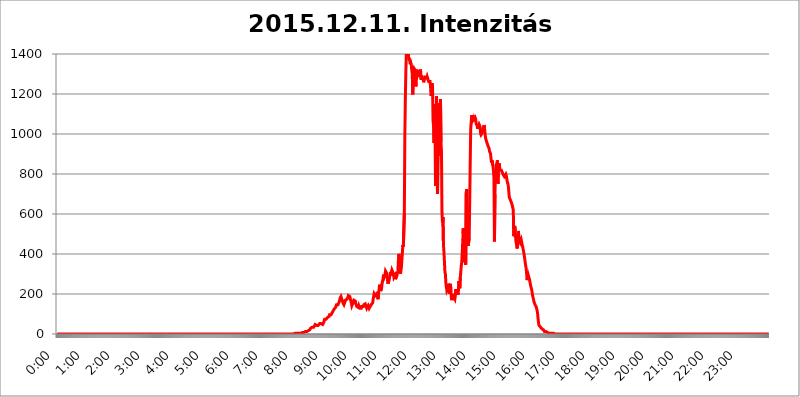
| Category | 2015.12.11. Intenzitás [W/m^2] |
|---|---|
| 0.0 | 0 |
| 0.0006944444444444445 | 0 |
| 0.001388888888888889 | 0 |
| 0.0020833333333333333 | 0 |
| 0.002777777777777778 | 0 |
| 0.003472222222222222 | 0 |
| 0.004166666666666667 | 0 |
| 0.004861111111111111 | 0 |
| 0.005555555555555556 | 0 |
| 0.0062499999999999995 | 0 |
| 0.006944444444444444 | 0 |
| 0.007638888888888889 | 0 |
| 0.008333333333333333 | 0 |
| 0.009027777777777779 | 0 |
| 0.009722222222222222 | 0 |
| 0.010416666666666666 | 0 |
| 0.011111111111111112 | 0 |
| 0.011805555555555555 | 0 |
| 0.012499999999999999 | 0 |
| 0.013194444444444444 | 0 |
| 0.013888888888888888 | 0 |
| 0.014583333333333332 | 0 |
| 0.015277777777777777 | 0 |
| 0.015972222222222224 | 0 |
| 0.016666666666666666 | 0 |
| 0.017361111111111112 | 0 |
| 0.018055555555555557 | 0 |
| 0.01875 | 0 |
| 0.019444444444444445 | 0 |
| 0.02013888888888889 | 0 |
| 0.020833333333333332 | 0 |
| 0.02152777777777778 | 0 |
| 0.022222222222222223 | 0 |
| 0.02291666666666667 | 0 |
| 0.02361111111111111 | 0 |
| 0.024305555555555556 | 0 |
| 0.024999999999999998 | 0 |
| 0.025694444444444447 | 0 |
| 0.02638888888888889 | 0 |
| 0.027083333333333334 | 0 |
| 0.027777777777777776 | 0 |
| 0.02847222222222222 | 0 |
| 0.029166666666666664 | 0 |
| 0.029861111111111113 | 0 |
| 0.030555555555555555 | 0 |
| 0.03125 | 0 |
| 0.03194444444444445 | 0 |
| 0.03263888888888889 | 0 |
| 0.03333333333333333 | 0 |
| 0.034027777777777775 | 0 |
| 0.034722222222222224 | 0 |
| 0.035416666666666666 | 0 |
| 0.036111111111111115 | 0 |
| 0.03680555555555556 | 0 |
| 0.0375 | 0 |
| 0.03819444444444444 | 0 |
| 0.03888888888888889 | 0 |
| 0.03958333333333333 | 0 |
| 0.04027777777777778 | 0 |
| 0.04097222222222222 | 0 |
| 0.041666666666666664 | 0 |
| 0.042361111111111106 | 0 |
| 0.04305555555555556 | 0 |
| 0.043750000000000004 | 0 |
| 0.044444444444444446 | 0 |
| 0.04513888888888889 | 0 |
| 0.04583333333333334 | 0 |
| 0.04652777777777778 | 0 |
| 0.04722222222222222 | 0 |
| 0.04791666666666666 | 0 |
| 0.04861111111111111 | 0 |
| 0.049305555555555554 | 0 |
| 0.049999999999999996 | 0 |
| 0.05069444444444445 | 0 |
| 0.051388888888888894 | 0 |
| 0.052083333333333336 | 0 |
| 0.05277777777777778 | 0 |
| 0.05347222222222222 | 0 |
| 0.05416666666666667 | 0 |
| 0.05486111111111111 | 0 |
| 0.05555555555555555 | 0 |
| 0.05625 | 0 |
| 0.05694444444444444 | 0 |
| 0.057638888888888885 | 0 |
| 0.05833333333333333 | 0 |
| 0.05902777777777778 | 0 |
| 0.059722222222222225 | 0 |
| 0.06041666666666667 | 0 |
| 0.061111111111111116 | 0 |
| 0.06180555555555556 | 0 |
| 0.0625 | 0 |
| 0.06319444444444444 | 0 |
| 0.06388888888888888 | 0 |
| 0.06458333333333334 | 0 |
| 0.06527777777777778 | 0 |
| 0.06597222222222222 | 0 |
| 0.06666666666666667 | 0 |
| 0.06736111111111111 | 0 |
| 0.06805555555555555 | 0 |
| 0.06874999999999999 | 0 |
| 0.06944444444444443 | 0 |
| 0.07013888888888889 | 0 |
| 0.07083333333333333 | 0 |
| 0.07152777777777779 | 0 |
| 0.07222222222222223 | 0 |
| 0.07291666666666667 | 0 |
| 0.07361111111111111 | 0 |
| 0.07430555555555556 | 0 |
| 0.075 | 0 |
| 0.07569444444444444 | 0 |
| 0.0763888888888889 | 0 |
| 0.07708333333333334 | 0 |
| 0.07777777777777778 | 0 |
| 0.07847222222222222 | 0 |
| 0.07916666666666666 | 0 |
| 0.0798611111111111 | 0 |
| 0.08055555555555556 | 0 |
| 0.08125 | 0 |
| 0.08194444444444444 | 0 |
| 0.08263888888888889 | 0 |
| 0.08333333333333333 | 0 |
| 0.08402777777777777 | 0 |
| 0.08472222222222221 | 0 |
| 0.08541666666666665 | 0 |
| 0.08611111111111112 | 0 |
| 0.08680555555555557 | 0 |
| 0.08750000000000001 | 0 |
| 0.08819444444444445 | 0 |
| 0.08888888888888889 | 0 |
| 0.08958333333333333 | 0 |
| 0.09027777777777778 | 0 |
| 0.09097222222222222 | 0 |
| 0.09166666666666667 | 0 |
| 0.09236111111111112 | 0 |
| 0.09305555555555556 | 0 |
| 0.09375 | 0 |
| 0.09444444444444444 | 0 |
| 0.09513888888888888 | 0 |
| 0.09583333333333333 | 0 |
| 0.09652777777777777 | 0 |
| 0.09722222222222222 | 0 |
| 0.09791666666666667 | 0 |
| 0.09861111111111111 | 0 |
| 0.09930555555555555 | 0 |
| 0.09999999999999999 | 0 |
| 0.10069444444444443 | 0 |
| 0.1013888888888889 | 0 |
| 0.10208333333333335 | 0 |
| 0.10277777777777779 | 0 |
| 0.10347222222222223 | 0 |
| 0.10416666666666667 | 0 |
| 0.10486111111111111 | 0 |
| 0.10555555555555556 | 0 |
| 0.10625 | 0 |
| 0.10694444444444444 | 0 |
| 0.1076388888888889 | 0 |
| 0.10833333333333334 | 0 |
| 0.10902777777777778 | 0 |
| 0.10972222222222222 | 0 |
| 0.1111111111111111 | 0 |
| 0.11180555555555556 | 0 |
| 0.11180555555555556 | 0 |
| 0.1125 | 0 |
| 0.11319444444444444 | 0 |
| 0.11388888888888889 | 0 |
| 0.11458333333333333 | 0 |
| 0.11527777777777777 | 0 |
| 0.11597222222222221 | 0 |
| 0.11666666666666665 | 0 |
| 0.1173611111111111 | 0 |
| 0.11805555555555557 | 0 |
| 0.11944444444444445 | 0 |
| 0.12013888888888889 | 0 |
| 0.12083333333333333 | 0 |
| 0.12152777777777778 | 0 |
| 0.12222222222222223 | 0 |
| 0.12291666666666667 | 0 |
| 0.12291666666666667 | 0 |
| 0.12361111111111112 | 0 |
| 0.12430555555555556 | 0 |
| 0.125 | 0 |
| 0.12569444444444444 | 0 |
| 0.12638888888888888 | 0 |
| 0.12708333333333333 | 0 |
| 0.16875 | 0 |
| 0.12847222222222224 | 0 |
| 0.12916666666666668 | 0 |
| 0.12986111111111112 | 0 |
| 0.13055555555555556 | 0 |
| 0.13125 | 0 |
| 0.13194444444444445 | 0 |
| 0.1326388888888889 | 0 |
| 0.13333333333333333 | 0 |
| 0.13402777777777777 | 0 |
| 0.13402777777777777 | 0 |
| 0.13472222222222222 | 0 |
| 0.13541666666666666 | 0 |
| 0.1361111111111111 | 0 |
| 0.13749999999999998 | 0 |
| 0.13819444444444443 | 0 |
| 0.1388888888888889 | 0 |
| 0.13958333333333334 | 0 |
| 0.14027777777777778 | 0 |
| 0.14097222222222222 | 0 |
| 0.14166666666666666 | 0 |
| 0.1423611111111111 | 0 |
| 0.14305555555555557 | 0 |
| 0.14375000000000002 | 0 |
| 0.14444444444444446 | 0 |
| 0.1451388888888889 | 0 |
| 0.1451388888888889 | 0 |
| 0.14652777777777778 | 0 |
| 0.14722222222222223 | 0 |
| 0.14791666666666667 | 0 |
| 0.1486111111111111 | 0 |
| 0.14930555555555555 | 0 |
| 0.15 | 0 |
| 0.15069444444444444 | 0 |
| 0.15138888888888888 | 0 |
| 0.15208333333333332 | 0 |
| 0.15277777777777776 | 0 |
| 0.15347222222222223 | 0 |
| 0.15416666666666667 | 0 |
| 0.15486111111111112 | 0 |
| 0.15555555555555556 | 0 |
| 0.15625 | 0 |
| 0.15694444444444444 | 0 |
| 0.15763888888888888 | 0 |
| 0.15833333333333333 | 0 |
| 0.15902777777777777 | 0 |
| 0.15972222222222224 | 0 |
| 0.16041666666666668 | 0 |
| 0.16111111111111112 | 0 |
| 0.16180555555555556 | 0 |
| 0.1625 | 0 |
| 0.16319444444444445 | 0 |
| 0.1638888888888889 | 0 |
| 0.16458333333333333 | 0 |
| 0.16527777777777777 | 0 |
| 0.16597222222222222 | 0 |
| 0.16666666666666666 | 0 |
| 0.1673611111111111 | 0 |
| 0.16805555555555554 | 0 |
| 0.16874999999999998 | 0 |
| 0.16944444444444443 | 0 |
| 0.17013888888888887 | 0 |
| 0.1708333333333333 | 0 |
| 0.17152777777777775 | 0 |
| 0.17222222222222225 | 0 |
| 0.1729166666666667 | 0 |
| 0.17361111111111113 | 0 |
| 0.17430555555555557 | 0 |
| 0.17500000000000002 | 0 |
| 0.17569444444444446 | 0 |
| 0.1763888888888889 | 0 |
| 0.17708333333333334 | 0 |
| 0.17777777777777778 | 0 |
| 0.17847222222222223 | 0 |
| 0.17916666666666667 | 0 |
| 0.1798611111111111 | 0 |
| 0.18055555555555555 | 0 |
| 0.18125 | 0 |
| 0.18194444444444444 | 0 |
| 0.1826388888888889 | 0 |
| 0.18333333333333335 | 0 |
| 0.1840277777777778 | 0 |
| 0.18472222222222223 | 0 |
| 0.18541666666666667 | 0 |
| 0.18611111111111112 | 0 |
| 0.18680555555555556 | 0 |
| 0.1875 | 0 |
| 0.18819444444444444 | 0 |
| 0.18888888888888888 | 0 |
| 0.18958333333333333 | 0 |
| 0.19027777777777777 | 0 |
| 0.1909722222222222 | 0 |
| 0.19166666666666665 | 0 |
| 0.19236111111111112 | 0 |
| 0.19305555555555554 | 0 |
| 0.19375 | 0 |
| 0.19444444444444445 | 0 |
| 0.1951388888888889 | 0 |
| 0.19583333333333333 | 0 |
| 0.19652777777777777 | 0 |
| 0.19722222222222222 | 0 |
| 0.19791666666666666 | 0 |
| 0.1986111111111111 | 0 |
| 0.19930555555555554 | 0 |
| 0.19999999999999998 | 0 |
| 0.20069444444444443 | 0 |
| 0.20138888888888887 | 0 |
| 0.2020833333333333 | 0 |
| 0.2027777777777778 | 0 |
| 0.2034722222222222 | 0 |
| 0.2041666666666667 | 0 |
| 0.20486111111111113 | 0 |
| 0.20555555555555557 | 0 |
| 0.20625000000000002 | 0 |
| 0.20694444444444446 | 0 |
| 0.2076388888888889 | 0 |
| 0.20833333333333334 | 0 |
| 0.20902777777777778 | 0 |
| 0.20972222222222223 | 0 |
| 0.21041666666666667 | 0 |
| 0.2111111111111111 | 0 |
| 0.21180555555555555 | 0 |
| 0.2125 | 0 |
| 0.21319444444444444 | 0 |
| 0.2138888888888889 | 0 |
| 0.21458333333333335 | 0 |
| 0.2152777777777778 | 0 |
| 0.21597222222222223 | 0 |
| 0.21666666666666667 | 0 |
| 0.21736111111111112 | 0 |
| 0.21805555555555556 | 0 |
| 0.21875 | 0 |
| 0.21944444444444444 | 0 |
| 0.22013888888888888 | 0 |
| 0.22083333333333333 | 0 |
| 0.22152777777777777 | 0 |
| 0.2222222222222222 | 0 |
| 0.22291666666666665 | 0 |
| 0.2236111111111111 | 0 |
| 0.22430555555555556 | 0 |
| 0.225 | 0 |
| 0.22569444444444445 | 0 |
| 0.2263888888888889 | 0 |
| 0.22708333333333333 | 0 |
| 0.22777777777777777 | 0 |
| 0.22847222222222222 | 0 |
| 0.22916666666666666 | 0 |
| 0.2298611111111111 | 0 |
| 0.23055555555555554 | 0 |
| 0.23124999999999998 | 0 |
| 0.23194444444444443 | 0 |
| 0.23263888888888887 | 0 |
| 0.2333333333333333 | 0 |
| 0.2340277777777778 | 0 |
| 0.2347222222222222 | 0 |
| 0.2354166666666667 | 0 |
| 0.23611111111111113 | 0 |
| 0.23680555555555557 | 0 |
| 0.23750000000000002 | 0 |
| 0.23819444444444446 | 0 |
| 0.2388888888888889 | 0 |
| 0.23958333333333334 | 0 |
| 0.24027777777777778 | 0 |
| 0.24097222222222223 | 0 |
| 0.24166666666666667 | 0 |
| 0.2423611111111111 | 0 |
| 0.24305555555555555 | 0 |
| 0.24375 | 0 |
| 0.24444444444444446 | 0 |
| 0.24513888888888888 | 0 |
| 0.24583333333333335 | 0 |
| 0.2465277777777778 | 0 |
| 0.24722222222222223 | 0 |
| 0.24791666666666667 | 0 |
| 0.24861111111111112 | 0 |
| 0.24930555555555556 | 0 |
| 0.25 | 0 |
| 0.25069444444444444 | 0 |
| 0.2513888888888889 | 0 |
| 0.2520833333333333 | 0 |
| 0.25277777777777777 | 0 |
| 0.2534722222222222 | 0 |
| 0.25416666666666665 | 0 |
| 0.2548611111111111 | 0 |
| 0.2555555555555556 | 0 |
| 0.25625000000000003 | 0 |
| 0.2569444444444445 | 0 |
| 0.2576388888888889 | 0 |
| 0.25833333333333336 | 0 |
| 0.2590277777777778 | 0 |
| 0.25972222222222224 | 0 |
| 0.2604166666666667 | 0 |
| 0.2611111111111111 | 0 |
| 0.26180555555555557 | 0 |
| 0.2625 | 0 |
| 0.26319444444444445 | 0 |
| 0.2638888888888889 | 0 |
| 0.26458333333333334 | 0 |
| 0.2652777777777778 | 0 |
| 0.2659722222222222 | 0 |
| 0.26666666666666666 | 0 |
| 0.2673611111111111 | 0 |
| 0.26805555555555555 | 0 |
| 0.26875 | 0 |
| 0.26944444444444443 | 0 |
| 0.2701388888888889 | 0 |
| 0.2708333333333333 | 0 |
| 0.27152777777777776 | 0 |
| 0.2722222222222222 | 0 |
| 0.27291666666666664 | 0 |
| 0.2736111111111111 | 0 |
| 0.2743055555555555 | 0 |
| 0.27499999999999997 | 0 |
| 0.27569444444444446 | 0 |
| 0.27638888888888885 | 0 |
| 0.27708333333333335 | 0 |
| 0.2777777777777778 | 0 |
| 0.27847222222222223 | 0 |
| 0.2791666666666667 | 0 |
| 0.2798611111111111 | 0 |
| 0.28055555555555556 | 0 |
| 0.28125 | 0 |
| 0.28194444444444444 | 0 |
| 0.2826388888888889 | 0 |
| 0.2833333333333333 | 0 |
| 0.28402777777777777 | 0 |
| 0.2847222222222222 | 0 |
| 0.28541666666666665 | 0 |
| 0.28611111111111115 | 0 |
| 0.28680555555555554 | 0 |
| 0.28750000000000003 | 0 |
| 0.2881944444444445 | 0 |
| 0.2888888888888889 | 0 |
| 0.28958333333333336 | 0 |
| 0.2902777777777778 | 0 |
| 0.29097222222222224 | 0 |
| 0.2916666666666667 | 0 |
| 0.2923611111111111 | 0 |
| 0.29305555555555557 | 0 |
| 0.29375 | 0 |
| 0.29444444444444445 | 0 |
| 0.2951388888888889 | 0 |
| 0.29583333333333334 | 0 |
| 0.2965277777777778 | 0 |
| 0.2972222222222222 | 0 |
| 0.29791666666666666 | 0 |
| 0.2986111111111111 | 0 |
| 0.29930555555555555 | 0 |
| 0.3 | 0 |
| 0.30069444444444443 | 0 |
| 0.3013888888888889 | 0 |
| 0.3020833333333333 | 0 |
| 0.30277777777777776 | 0 |
| 0.3034722222222222 | 0 |
| 0.30416666666666664 | 0 |
| 0.3048611111111111 | 0 |
| 0.3055555555555555 | 0 |
| 0.30624999999999997 | 0 |
| 0.3069444444444444 | 0 |
| 0.3076388888888889 | 0 |
| 0.30833333333333335 | 0 |
| 0.3090277777777778 | 0 |
| 0.30972222222222223 | 0 |
| 0.3104166666666667 | 0 |
| 0.3111111111111111 | 0 |
| 0.31180555555555556 | 0 |
| 0.3125 | 0 |
| 0.31319444444444444 | 0 |
| 0.3138888888888889 | 0 |
| 0.3145833333333333 | 0 |
| 0.31527777777777777 | 0 |
| 0.3159722222222222 | 0 |
| 0.31666666666666665 | 0 |
| 0.31736111111111115 | 0 |
| 0.31805555555555554 | 0 |
| 0.31875000000000003 | 0 |
| 0.3194444444444445 | 0 |
| 0.3201388888888889 | 0 |
| 0.32083333333333336 | 0 |
| 0.3215277777777778 | 0 |
| 0.32222222222222224 | 0 |
| 0.3229166666666667 | 0 |
| 0.3236111111111111 | 0 |
| 0.32430555555555557 | 0 |
| 0.325 | 0 |
| 0.32569444444444445 | 0 |
| 0.3263888888888889 | 0 |
| 0.32708333333333334 | 0 |
| 0.3277777777777778 | 0 |
| 0.3284722222222222 | 0 |
| 0.32916666666666666 | 0 |
| 0.3298611111111111 | 0 |
| 0.33055555555555555 | 0 |
| 0.33125 | 0 |
| 0.33194444444444443 | 0 |
| 0.3326388888888889 | 0 |
| 0.3333333333333333 | 3.525 |
| 0.3340277777777778 | 3.525 |
| 0.3347222222222222 | 3.525 |
| 0.3354166666666667 | 3.525 |
| 0.3361111111111111 | 3.525 |
| 0.3368055555555556 | 3.525 |
| 0.33749999999999997 | 3.525 |
| 0.33819444444444446 | 3.525 |
| 0.33888888888888885 | 3.525 |
| 0.33958333333333335 | 3.525 |
| 0.34027777777777773 | 3.525 |
| 0.34097222222222223 | 3.525 |
| 0.3416666666666666 | 3.525 |
| 0.3423611111111111 | 3.525 |
| 0.3430555555555555 | 3.525 |
| 0.34375 | 7.887 |
| 0.3444444444444445 | 7.887 |
| 0.3451388888888889 | 7.887 |
| 0.3458333333333334 | 7.887 |
| 0.34652777777777777 | 12.257 |
| 0.34722222222222227 | 12.257 |
| 0.34791666666666665 | 12.257 |
| 0.34861111111111115 | 12.257 |
| 0.34930555555555554 | 12.257 |
| 0.35000000000000003 | 12.257 |
| 0.3506944444444444 | 12.257 |
| 0.3513888888888889 | 12.257 |
| 0.3520833333333333 | 16.636 |
| 0.3527777777777778 | 21.024 |
| 0.3534722222222222 | 21.024 |
| 0.3541666666666667 | 21.024 |
| 0.3548611111111111 | 25.419 |
| 0.35555555555555557 | 29.823 |
| 0.35625 | 29.823 |
| 0.35694444444444445 | 29.823 |
| 0.3576388888888889 | 34.234 |
| 0.35833333333333334 | 34.234 |
| 0.3590277777777778 | 34.234 |
| 0.3597222222222222 | 34.234 |
| 0.36041666666666666 | 38.653 |
| 0.3611111111111111 | 38.653 |
| 0.36180555555555555 | 47.511 |
| 0.3625 | 47.511 |
| 0.36319444444444443 | 43.079 |
| 0.3638888888888889 | 43.079 |
| 0.3645833333333333 | 38.653 |
| 0.3652777777777778 | 38.653 |
| 0.3659722222222222 | 43.079 |
| 0.3666666666666667 | 47.511 |
| 0.3673611111111111 | 47.511 |
| 0.3680555555555556 | 51.951 |
| 0.36874999999999997 | 51.951 |
| 0.36944444444444446 | 51.951 |
| 0.37013888888888885 | 51.951 |
| 0.37083333333333335 | 47.511 |
| 0.37152777777777773 | 47.511 |
| 0.37222222222222223 | 47.511 |
| 0.3729166666666666 | 51.951 |
| 0.3736111111111111 | 56.398 |
| 0.3743055555555555 | 65.31 |
| 0.375 | 74.246 |
| 0.3756944444444445 | 74.246 |
| 0.3763888888888889 | 78.722 |
| 0.3770833333333334 | 74.246 |
| 0.37777777777777777 | 74.246 |
| 0.37847222222222227 | 74.246 |
| 0.37916666666666665 | 83.205 |
| 0.37986111111111115 | 87.692 |
| 0.38055555555555554 | 87.692 |
| 0.38125000000000003 | 87.692 |
| 0.3819444444444444 | 96.682 |
| 0.3826388888888889 | 96.682 |
| 0.3833333333333333 | 96.682 |
| 0.3840277777777778 | 96.682 |
| 0.3847222222222222 | 101.184 |
| 0.3854166666666667 | 101.184 |
| 0.3861111111111111 | 110.201 |
| 0.38680555555555557 | 110.201 |
| 0.3875 | 114.716 |
| 0.38819444444444445 | 123.758 |
| 0.3888888888888889 | 128.284 |
| 0.38958333333333334 | 128.284 |
| 0.3902777777777778 | 132.814 |
| 0.3909722222222222 | 137.347 |
| 0.39166666666666666 | 146.423 |
| 0.3923611111111111 | 146.423 |
| 0.39305555555555555 | 146.423 |
| 0.39375 | 146.423 |
| 0.39444444444444443 | 146.423 |
| 0.3951388888888889 | 146.423 |
| 0.3958333333333333 | 164.605 |
| 0.3965277777777778 | 178.264 |
| 0.3972222222222222 | 182.82 |
| 0.3979166666666667 | 187.378 |
| 0.3986111111111111 | 187.378 |
| 0.3993055555555556 | 182.82 |
| 0.39999999999999997 | 164.605 |
| 0.40069444444444446 | 155.509 |
| 0.40138888888888885 | 150.964 |
| 0.40208333333333335 | 146.423 |
| 0.40277777777777773 | 150.964 |
| 0.40347222222222223 | 160.056 |
| 0.4041666666666666 | 169.156 |
| 0.4048611111111111 | 173.709 |
| 0.4055555555555555 | 173.709 |
| 0.40625 | 173.709 |
| 0.4069444444444445 | 169.156 |
| 0.4076388888888889 | 182.82 |
| 0.4083333333333334 | 191.937 |
| 0.40902777777777777 | 191.937 |
| 0.40972222222222227 | 191.937 |
| 0.41041666666666665 | 187.378 |
| 0.41111111111111115 | 173.709 |
| 0.41180555555555554 | 164.605 |
| 0.41250000000000003 | 155.509 |
| 0.4131944444444444 | 141.884 |
| 0.4138888888888889 | 141.884 |
| 0.4145833333333333 | 146.423 |
| 0.4152777777777778 | 160.056 |
| 0.4159722222222222 | 169.156 |
| 0.4166666666666667 | 173.709 |
| 0.4173611111111111 | 173.709 |
| 0.41805555555555557 | 164.605 |
| 0.41875 | 150.964 |
| 0.41944444444444445 | 146.423 |
| 0.4201388888888889 | 137.347 |
| 0.42083333333333334 | 141.884 |
| 0.4215277777777778 | 141.884 |
| 0.4222222222222222 | 132.814 |
| 0.42291666666666666 | 141.884 |
| 0.4236111111111111 | 137.347 |
| 0.42430555555555555 | 128.284 |
| 0.425 | 128.284 |
| 0.42569444444444443 | 128.284 |
| 0.4263888888888889 | 128.284 |
| 0.4270833333333333 | 137.347 |
| 0.4277777777777778 | 137.347 |
| 0.4284722222222222 | 132.814 |
| 0.4291666666666667 | 137.347 |
| 0.4298611111111111 | 146.423 |
| 0.4305555555555556 | 146.423 |
| 0.43124999999999997 | 150.964 |
| 0.43194444444444446 | 150.964 |
| 0.43263888888888885 | 150.964 |
| 0.43333333333333335 | 146.423 |
| 0.43402777777777773 | 128.284 |
| 0.43472222222222223 | 123.758 |
| 0.4354166666666666 | 132.814 |
| 0.4361111111111111 | 141.884 |
| 0.4368055555555555 | 137.347 |
| 0.4375 | 128.284 |
| 0.4381944444444445 | 128.284 |
| 0.4388888888888889 | 137.347 |
| 0.4395833333333334 | 141.884 |
| 0.44027777777777777 | 146.423 |
| 0.44097222222222227 | 146.423 |
| 0.44166666666666665 | 141.884 |
| 0.44236111111111115 | 155.509 |
| 0.44305555555555554 | 173.709 |
| 0.44375000000000003 | 187.378 |
| 0.4444444444444444 | 201.058 |
| 0.4451388888888889 | 196.497 |
| 0.4458333333333333 | 191.937 |
| 0.4465277777777778 | 196.497 |
| 0.4472222222222222 | 196.497 |
| 0.4479166666666667 | 201.058 |
| 0.4486111111111111 | 191.937 |
| 0.44930555555555557 | 182.82 |
| 0.45 | 173.709 |
| 0.45069444444444445 | 201.058 |
| 0.4513888888888889 | 223.873 |
| 0.45208333333333334 | 246.689 |
| 0.4527777777777778 | 237.564 |
| 0.4534722222222222 | 214.746 |
| 0.45416666666666666 | 214.746 |
| 0.4548611111111111 | 228.436 |
| 0.45555555555555555 | 251.251 |
| 0.45625 | 264.932 |
| 0.45694444444444443 | 274.047 |
| 0.4576388888888889 | 296.808 |
| 0.4583333333333333 | 283.156 |
| 0.4590277777777778 | 287.709 |
| 0.4597222222222222 | 296.808 |
| 0.4604166666666667 | 314.98 |
| 0.4611111111111111 | 314.98 |
| 0.4618055555555556 | 305.898 |
| 0.46249999999999997 | 287.709 |
| 0.46319444444444446 | 269.49 |
| 0.46388888888888885 | 251.251 |
| 0.46458333333333335 | 255.813 |
| 0.46527777777777773 | 269.49 |
| 0.46597222222222223 | 278.603 |
| 0.4666666666666666 | 296.808 |
| 0.4673611111111111 | 310.44 |
| 0.4680555555555555 | 292.259 |
| 0.46875 | 292.259 |
| 0.4694444444444445 | 319.517 |
| 0.4701388888888889 | 319.517 |
| 0.4708333333333334 | 314.98 |
| 0.47152777777777777 | 301.354 |
| 0.47222222222222227 | 283.156 |
| 0.47291666666666665 | 283.156 |
| 0.47361111111111115 | 292.259 |
| 0.47430555555555554 | 274.047 |
| 0.47500000000000003 | 269.49 |
| 0.4756944444444444 | 274.047 |
| 0.4763888888888889 | 292.259 |
| 0.4770833333333333 | 296.808 |
| 0.4777777777777778 | 314.98 |
| 0.4784722222222222 | 369.23 |
| 0.4791666666666667 | 400.638 |
| 0.4798611111111111 | 382.715 |
| 0.48055555555555557 | 360.221 |
| 0.48125 | 301.354 |
| 0.48194444444444445 | 314.98 |
| 0.4826388888888889 | 333.113 |
| 0.48333333333333334 | 369.23 |
| 0.4840277777777778 | 405.108 |
| 0.4847222222222222 | 445.129 |
| 0.48541666666666666 | 436.27 |
| 0.4861111111111111 | 440.702 |
| 0.48680555555555555 | 604.864 |
| 0.4875 | 984.98 |
| 0.48819444444444443 | 1170.358 |
| 0.4888888888888889 | 1304.795 |
| 0.4895833333333333 | 1403.469 |
| 0.4902777777777778 | 1412.921 |
| 0.4909722222222222 | 1403.469 |
| 0.4916666666666667 | 1412.921 |
| 0.4923611111111111 | 1403.469 |
| 0.4930555555555556 | 1375.633 |
| 0.49374999999999997 | 1375.633 |
| 0.49444444444444446 | 1366.519 |
| 0.49513888888888885 | 1348.524 |
| 0.49583333333333335 | 1357.483 |
| 0.49652777777777773 | 1348.524 |
| 0.49722222222222223 | 1317.736 |
| 0.4979166666666666 | 1300.514 |
| 0.4986111111111111 | 1197.876 |
| 0.4993055555555555 | 1300.514 |
| 0.5 | 1313.406 |
| 0.5006944444444444 | 1326.445 |
| 0.5013888888888889 | 1322.082 |
| 0.5020833333333333 | 1317.736 |
| 0.5027777777777778 | 1238.014 |
| 0.5034722222222222 | 1250.275 |
| 0.5041666666666667 | 1322.082 |
| 0.5048611111111111 | 1296.248 |
| 0.5055555555555555 | 1304.795 |
| 0.50625 | 1304.795 |
| 0.5069444444444444 | 1296.248 |
| 0.5076388888888889 | 1304.795 |
| 0.5083333333333333 | 1287.761 |
| 0.5090277777777777 | 1322.082 |
| 0.5097222222222222 | 1313.406 |
| 0.5104166666666666 | 1270.964 |
| 0.5111111111111112 | 1291.997 |
| 0.5118055555555555 | 1283.541 |
| 0.5125000000000001 | 1279.334 |
| 0.5131944444444444 | 1275.142 |
| 0.513888888888889 | 1258.511 |
| 0.5145833333333333 | 1270.964 |
| 0.5152777777777778 | 1266.8 |
| 0.5159722222222222 | 1283.541 |
| 0.5166666666666667 | 1283.541 |
| 0.517361111111111 | 1287.761 |
| 0.5180555555555556 | 1279.334 |
| 0.5187499999999999 | 1287.761 |
| 0.5194444444444445 | 1283.541 |
| 0.5201388888888888 | 1270.964 |
| 0.5208333333333334 | 1262.649 |
| 0.5215277777777778 | 1258.511 |
| 0.5222222222222223 | 1266.8 |
| 0.5229166666666667 | 1262.649 |
| 0.5236111111111111 | 1233.951 |
| 0.5243055555555556 | 1189.969 |
| 0.525 | 1197.876 |
| 0.5256944444444445 | 1254.387 |
| 0.5263888888888889 | 1229.899 |
| 0.5270833333333333 | 1067.267 |
| 0.5277777777777778 | 1041.019 |
| 0.5284722222222222 | 955.071 |
| 0.5291666666666667 | 1147.086 |
| 0.5298611111111111 | 1022.323 |
| 0.5305555555555556 | 739.877 |
| 0.53125 | 909.996 |
| 0.5319444444444444 | 1189.969 |
| 0.5326388888888889 | 837.682 |
| 0.5333333333333333 | 699.717 |
| 0.5340277777777778 | 951.327 |
| 0.5347222222222222 | 984.98 |
| 0.5354166666666667 | 1154.814 |
| 0.5361111111111111 | 891.099 |
| 0.5368055555555555 | 928.819 |
| 0.5375 | 1174.263 |
| 0.5381944444444444 | 958.814 |
| 0.5388888888888889 | 913.766 |
| 0.5395833333333333 | 609.062 |
| 0.5402777777777777 | 558.261 |
| 0.5409722222222222 | 583.779 |
| 0.5416666666666666 | 445.129 |
| 0.5423611111111112 | 409.574 |
| 0.5430555555555555 | 405.108 |
| 0.5437500000000001 | 310.44 |
| 0.5444444444444444 | 296.808 |
| 0.545138888888889 | 251.251 |
| 0.5458333333333333 | 255.813 |
| 0.5465277777777778 | 214.746 |
| 0.5472222222222222 | 210.182 |
| 0.5479166666666667 | 223.873 |
| 0.548611111111111 | 251.251 |
| 0.5493055555555556 | 242.127 |
| 0.5499999999999999 | 201.058 |
| 0.5506944444444445 | 242.127 |
| 0.5513888888888888 | 251.251 |
| 0.5520833333333334 | 219.309 |
| 0.5527777777777778 | 178.264 |
| 0.5534722222222223 | 169.156 |
| 0.5541666666666667 | 182.82 |
| 0.5548611111111111 | 182.82 |
| 0.5555555555555556 | 201.058 |
| 0.55625 | 182.82 |
| 0.5569444444444445 | 187.378 |
| 0.5576388888888889 | 173.709 |
| 0.5583333333333333 | 191.937 |
| 0.5590277777777778 | 223.873 |
| 0.5597222222222222 | 201.058 |
| 0.5604166666666667 | 196.497 |
| 0.5611111111111111 | 214.746 |
| 0.5618055555555556 | 196.497 |
| 0.5625 | 205.62 |
| 0.5631944444444444 | 264.932 |
| 0.5638888888888889 | 260.373 |
| 0.5645833333333333 | 228.436 |
| 0.5652777777777778 | 283.156 |
| 0.5659722222222222 | 310.44 |
| 0.5666666666666667 | 342.162 |
| 0.5673611111111111 | 360.221 |
| 0.5680555555555555 | 409.574 |
| 0.56875 | 462.786 |
| 0.5694444444444444 | 528.2 |
| 0.5701388888888889 | 431.833 |
| 0.5708333333333333 | 360.221 |
| 0.5715277777777777 | 422.943 |
| 0.5722222222222222 | 355.712 |
| 0.5729166666666666 | 346.682 |
| 0.5736111111111112 | 707.8 |
| 0.5743055555555555 | 723.889 |
| 0.5750000000000001 | 445.129 |
| 0.5756944444444444 | 458.38 |
| 0.576388888888889 | 440.702 |
| 0.5770833333333333 | 436.27 |
| 0.5777777777777778 | 480.356 |
| 0.5784722222222222 | 654.791 |
| 0.5791666666666667 | 849.199 |
| 0.579861111111111 | 1022.323 |
| 0.5805555555555556 | 1059.756 |
| 0.5812499999999999 | 1093.653 |
| 0.5819444444444445 | 1089.873 |
| 0.5826388888888888 | 1071.027 |
| 0.5833333333333334 | 1074.789 |
| 0.5840277777777778 | 1082.324 |
| 0.5847222222222223 | 1074.789 |
| 0.5854166666666667 | 1071.027 |
| 0.5861111111111111 | 1082.324 |
| 0.5868055555555556 | 1074.789 |
| 0.5875 | 1052.255 |
| 0.5881944444444445 | 1048.508 |
| 0.5888888888888889 | 1041.019 |
| 0.5895833333333333 | 1026.06 |
| 0.5902777777777778 | 1029.798 |
| 0.5909722222222222 | 1041.019 |
| 0.5916666666666667 | 1048.508 |
| 0.5923611111111111 | 1044.762 |
| 0.5930555555555556 | 1037.277 |
| 0.59375 | 1003.65 |
| 0.5944444444444444 | 996.182 |
| 0.5951388888888889 | 992.448 |
| 0.5958333333333333 | 1003.65 |
| 0.5965277777777778 | 1007.383 |
| 0.5972222222222222 | 1018.587 |
| 0.5979166666666667 | 1033.537 |
| 0.5986111111111111 | 1044.762 |
| 0.5993055555555555 | 1029.798 |
| 0.6 | 999.916 |
| 0.6006944444444444 | 981.244 |
| 0.6013888888888889 | 970.034 |
| 0.6020833333333333 | 962.555 |
| 0.6027777777777777 | 966.295 |
| 0.6034722222222222 | 962.555 |
| 0.6041666666666666 | 940.082 |
| 0.6048611111111112 | 936.33 |
| 0.6055555555555555 | 928.819 |
| 0.6062500000000001 | 913.766 |
| 0.6069444444444444 | 909.996 |
| 0.607638888888889 | 902.447 |
| 0.6083333333333333 | 879.719 |
| 0.6090277777777778 | 856.855 |
| 0.6097222222222222 | 868.305 |
| 0.6104166666666667 | 868.305 |
| 0.611111111111111 | 841.526 |
| 0.6118055555555556 | 814.519 |
| 0.6124999999999999 | 779.42 |
| 0.6131944444444445 | 462.786 |
| 0.6138888888888888 | 699.717 |
| 0.6145833333333334 | 795.074 |
| 0.6152777777777778 | 810.641 |
| 0.6159722222222223 | 845.365 |
| 0.6166666666666667 | 845.365 |
| 0.6173611111111111 | 868.305 |
| 0.6180555555555556 | 751.803 |
| 0.61875 | 829.981 |
| 0.6194444444444445 | 853.029 |
| 0.6201388888888889 | 845.365 |
| 0.6208333333333333 | 818.392 |
| 0.6215277777777778 | 818.392 |
| 0.6222222222222222 | 818.392 |
| 0.6229166666666667 | 818.392 |
| 0.6236111111111111 | 818.392 |
| 0.6243055555555556 | 806.757 |
| 0.625 | 806.757 |
| 0.6256944444444444 | 795.074 |
| 0.6263888888888889 | 795.074 |
| 0.6270833333333333 | 787.258 |
| 0.6277777777777778 | 791.169 |
| 0.6284722222222222 | 791.169 |
| 0.6291666666666667 | 798.974 |
| 0.6298611111111111 | 791.169 |
| 0.6305555555555555 | 775.492 |
| 0.63125 | 759.723 |
| 0.6319444444444444 | 751.803 |
| 0.6326388888888889 | 739.877 |
| 0.6333333333333333 | 711.832 |
| 0.6340277777777777 | 683.473 |
| 0.6347222222222222 | 679.395 |
| 0.6354166666666666 | 671.22 |
| 0.6361111111111112 | 667.123 |
| 0.6368055555555555 | 658.909 |
| 0.6375000000000001 | 650.667 |
| 0.6381944444444444 | 642.4 |
| 0.638888888888889 | 629.948 |
| 0.6395833333333333 | 621.613 |
| 0.6402777777777778 | 489.108 |
| 0.6409722222222222 | 532.513 |
| 0.6416666666666667 | 541.121 |
| 0.642361111111111 | 515.223 |
| 0.6430555555555556 | 471.582 |
| 0.6437499999999999 | 471.582 |
| 0.6444444444444445 | 440.702 |
| 0.6451388888888888 | 427.39 |
| 0.6458333333333334 | 467.187 |
| 0.6465277777777778 | 515.223 |
| 0.6472222222222223 | 497.836 |
| 0.6479166666666667 | 471.582 |
| 0.6486111111111111 | 467.187 |
| 0.6493055555555556 | 458.38 |
| 0.65 | 458.38 |
| 0.6506944444444445 | 471.582 |
| 0.6513888888888889 | 458.38 |
| 0.6520833333333333 | 445.129 |
| 0.6527777777777778 | 436.27 |
| 0.6534722222222222 | 422.943 |
| 0.6541666666666667 | 409.574 |
| 0.6548611111111111 | 396.164 |
| 0.6555555555555556 | 378.224 |
| 0.65625 | 360.221 |
| 0.6569444444444444 | 342.162 |
| 0.6576388888888889 | 328.584 |
| 0.6583333333333333 | 301.354 |
| 0.6590277777777778 | 269.49 |
| 0.6597222222222222 | 287.709 |
| 0.6604166666666667 | 296.808 |
| 0.6611111111111111 | 287.709 |
| 0.6618055555555555 | 283.156 |
| 0.6625 | 269.49 |
| 0.6631944444444444 | 255.813 |
| 0.6638888888888889 | 242.127 |
| 0.6645833333333333 | 233 |
| 0.6652777777777777 | 223.873 |
| 0.6659722222222222 | 210.182 |
| 0.6666666666666666 | 191.937 |
| 0.6673611111111111 | 182.82 |
| 0.6680555555555556 | 178.264 |
| 0.6687500000000001 | 160.056 |
| 0.6694444444444444 | 155.509 |
| 0.6701388888888888 | 146.423 |
| 0.6708333333333334 | 141.884 |
| 0.6715277777777778 | 137.347 |
| 0.6722222222222222 | 128.284 |
| 0.6729166666666666 | 119.235 |
| 0.6736111111111112 | 105.69 |
| 0.6743055555555556 | 78.722 |
| 0.6749999999999999 | 56.398 |
| 0.6756944444444444 | 43.079 |
| 0.6763888888888889 | 43.079 |
| 0.6770833333333334 | 38.653 |
| 0.6777777777777777 | 34.234 |
| 0.6784722222222223 | 34.234 |
| 0.6791666666666667 | 29.823 |
| 0.6798611111111111 | 25.419 |
| 0.6805555555555555 | 21.024 |
| 0.68125 | 21.024 |
| 0.6819444444444445 | 21.024 |
| 0.6826388888888889 | 16.636 |
| 0.6833333333333332 | 12.257 |
| 0.6840277777777778 | 12.257 |
| 0.6847222222222222 | 12.257 |
| 0.6854166666666667 | 12.257 |
| 0.686111111111111 | 7.887 |
| 0.6868055555555556 | 7.887 |
| 0.6875 | 7.887 |
| 0.6881944444444444 | 7.887 |
| 0.688888888888889 | 7.887 |
| 0.6895833333333333 | 3.525 |
| 0.6902777777777778 | 3.525 |
| 0.6909722222222222 | 3.525 |
| 0.6916666666666668 | 3.525 |
| 0.6923611111111111 | 3.525 |
| 0.6930555555555555 | 3.525 |
| 0.69375 | 3.525 |
| 0.6944444444444445 | 3.525 |
| 0.6951388888888889 | 3.525 |
| 0.6958333333333333 | 3.525 |
| 0.6965277777777777 | 3.525 |
| 0.6972222222222223 | 0 |
| 0.6979166666666666 | 0 |
| 0.6986111111111111 | 0 |
| 0.6993055555555556 | 0 |
| 0.7000000000000001 | 0 |
| 0.7006944444444444 | 0 |
| 0.7013888888888888 | 0 |
| 0.7020833333333334 | 0 |
| 0.7027777777777778 | 0 |
| 0.7034722222222222 | 0 |
| 0.7041666666666666 | 0 |
| 0.7048611111111112 | 0 |
| 0.7055555555555556 | 0 |
| 0.7062499999999999 | 0 |
| 0.7069444444444444 | 0 |
| 0.7076388888888889 | 0 |
| 0.7083333333333334 | 0 |
| 0.7090277777777777 | 0 |
| 0.7097222222222223 | 0 |
| 0.7104166666666667 | 0 |
| 0.7111111111111111 | 0 |
| 0.7118055555555555 | 0 |
| 0.7125 | 0 |
| 0.7131944444444445 | 0 |
| 0.7138888888888889 | 0 |
| 0.7145833333333332 | 0 |
| 0.7152777777777778 | 0 |
| 0.7159722222222222 | 0 |
| 0.7166666666666667 | 0 |
| 0.717361111111111 | 0 |
| 0.7180555555555556 | 0 |
| 0.71875 | 0 |
| 0.7194444444444444 | 0 |
| 0.720138888888889 | 0 |
| 0.7208333333333333 | 0 |
| 0.7215277777777778 | 0 |
| 0.7222222222222222 | 0 |
| 0.7229166666666668 | 0 |
| 0.7236111111111111 | 0 |
| 0.7243055555555555 | 0 |
| 0.725 | 0 |
| 0.7256944444444445 | 0 |
| 0.7263888888888889 | 0 |
| 0.7270833333333333 | 0 |
| 0.7277777777777777 | 0 |
| 0.7284722222222223 | 0 |
| 0.7291666666666666 | 0 |
| 0.7298611111111111 | 0 |
| 0.7305555555555556 | 0 |
| 0.7312500000000001 | 0 |
| 0.7319444444444444 | 0 |
| 0.7326388888888888 | 0 |
| 0.7333333333333334 | 0 |
| 0.7340277777777778 | 0 |
| 0.7347222222222222 | 0 |
| 0.7354166666666666 | 0 |
| 0.7361111111111112 | 0 |
| 0.7368055555555556 | 0 |
| 0.7374999999999999 | 0 |
| 0.7381944444444444 | 0 |
| 0.7388888888888889 | 0 |
| 0.7395833333333334 | 0 |
| 0.7402777777777777 | 0 |
| 0.7409722222222223 | 0 |
| 0.7416666666666667 | 0 |
| 0.7423611111111111 | 0 |
| 0.7430555555555555 | 0 |
| 0.74375 | 0 |
| 0.7444444444444445 | 0 |
| 0.7451388888888889 | 0 |
| 0.7458333333333332 | 0 |
| 0.7465277777777778 | 0 |
| 0.7472222222222222 | 0 |
| 0.7479166666666667 | 0 |
| 0.748611111111111 | 0 |
| 0.7493055555555556 | 0 |
| 0.75 | 0 |
| 0.7506944444444444 | 0 |
| 0.751388888888889 | 0 |
| 0.7520833333333333 | 0 |
| 0.7527777777777778 | 0 |
| 0.7534722222222222 | 0 |
| 0.7541666666666668 | 0 |
| 0.7548611111111111 | 0 |
| 0.7555555555555555 | 0 |
| 0.75625 | 0 |
| 0.7569444444444445 | 0 |
| 0.7576388888888889 | 0 |
| 0.7583333333333333 | 0 |
| 0.7590277777777777 | 0 |
| 0.7597222222222223 | 0 |
| 0.7604166666666666 | 0 |
| 0.7611111111111111 | 0 |
| 0.7618055555555556 | 0 |
| 0.7625000000000001 | 0 |
| 0.7631944444444444 | 0 |
| 0.7638888888888888 | 0 |
| 0.7645833333333334 | 0 |
| 0.7652777777777778 | 0 |
| 0.7659722222222222 | 0 |
| 0.7666666666666666 | 0 |
| 0.7673611111111112 | 0 |
| 0.7680555555555556 | 0 |
| 0.7687499999999999 | 0 |
| 0.7694444444444444 | 0 |
| 0.7701388888888889 | 0 |
| 0.7708333333333334 | 0 |
| 0.7715277777777777 | 0 |
| 0.7722222222222223 | 0 |
| 0.7729166666666667 | 0 |
| 0.7736111111111111 | 0 |
| 0.7743055555555555 | 0 |
| 0.775 | 0 |
| 0.7756944444444445 | 0 |
| 0.7763888888888889 | 0 |
| 0.7770833333333332 | 0 |
| 0.7777777777777778 | 0 |
| 0.7784722222222222 | 0 |
| 0.7791666666666667 | 0 |
| 0.779861111111111 | 0 |
| 0.7805555555555556 | 0 |
| 0.78125 | 0 |
| 0.7819444444444444 | 0 |
| 0.782638888888889 | 0 |
| 0.7833333333333333 | 0 |
| 0.7840277777777778 | 0 |
| 0.7847222222222222 | 0 |
| 0.7854166666666668 | 0 |
| 0.7861111111111111 | 0 |
| 0.7868055555555555 | 0 |
| 0.7875 | 0 |
| 0.7881944444444445 | 0 |
| 0.7888888888888889 | 0 |
| 0.7895833333333333 | 0 |
| 0.7902777777777777 | 0 |
| 0.7909722222222223 | 0 |
| 0.7916666666666666 | 0 |
| 0.7923611111111111 | 0 |
| 0.7930555555555556 | 0 |
| 0.7937500000000001 | 0 |
| 0.7944444444444444 | 0 |
| 0.7951388888888888 | 0 |
| 0.7958333333333334 | 0 |
| 0.7965277777777778 | 0 |
| 0.7972222222222222 | 0 |
| 0.7979166666666666 | 0 |
| 0.7986111111111112 | 0 |
| 0.7993055555555556 | 0 |
| 0.7999999999999999 | 0 |
| 0.8006944444444444 | 0 |
| 0.8013888888888889 | 0 |
| 0.8020833333333334 | 0 |
| 0.8027777777777777 | 0 |
| 0.8034722222222223 | 0 |
| 0.8041666666666667 | 0 |
| 0.8048611111111111 | 0 |
| 0.8055555555555555 | 0 |
| 0.80625 | 0 |
| 0.8069444444444445 | 0 |
| 0.8076388888888889 | 0 |
| 0.8083333333333332 | 0 |
| 0.8090277777777778 | 0 |
| 0.8097222222222222 | 0 |
| 0.8104166666666667 | 0 |
| 0.811111111111111 | 0 |
| 0.8118055555555556 | 0 |
| 0.8125 | 0 |
| 0.8131944444444444 | 0 |
| 0.813888888888889 | 0 |
| 0.8145833333333333 | 0 |
| 0.8152777777777778 | 0 |
| 0.8159722222222222 | 0 |
| 0.8166666666666668 | 0 |
| 0.8173611111111111 | 0 |
| 0.8180555555555555 | 0 |
| 0.81875 | 0 |
| 0.8194444444444445 | 0 |
| 0.8201388888888889 | 0 |
| 0.8208333333333333 | 0 |
| 0.8215277777777777 | 0 |
| 0.8222222222222223 | 0 |
| 0.8229166666666666 | 0 |
| 0.8236111111111111 | 0 |
| 0.8243055555555556 | 0 |
| 0.8250000000000001 | 0 |
| 0.8256944444444444 | 0 |
| 0.8263888888888888 | 0 |
| 0.8270833333333334 | 0 |
| 0.8277777777777778 | 0 |
| 0.8284722222222222 | 0 |
| 0.8291666666666666 | 0 |
| 0.8298611111111112 | 0 |
| 0.8305555555555556 | 0 |
| 0.8312499999999999 | 0 |
| 0.8319444444444444 | 0 |
| 0.8326388888888889 | 0 |
| 0.8333333333333334 | 0 |
| 0.8340277777777777 | 0 |
| 0.8347222222222223 | 0 |
| 0.8354166666666667 | 0 |
| 0.8361111111111111 | 0 |
| 0.8368055555555555 | 0 |
| 0.8375 | 0 |
| 0.8381944444444445 | 0 |
| 0.8388888888888889 | 0 |
| 0.8395833333333332 | 0 |
| 0.8402777777777778 | 0 |
| 0.8409722222222222 | 0 |
| 0.8416666666666667 | 0 |
| 0.842361111111111 | 0 |
| 0.8430555555555556 | 0 |
| 0.84375 | 0 |
| 0.8444444444444444 | 0 |
| 0.845138888888889 | 0 |
| 0.8458333333333333 | 0 |
| 0.8465277777777778 | 0 |
| 0.8472222222222222 | 0 |
| 0.8479166666666668 | 0 |
| 0.8486111111111111 | 0 |
| 0.8493055555555555 | 0 |
| 0.85 | 0 |
| 0.8506944444444445 | 0 |
| 0.8513888888888889 | 0 |
| 0.8520833333333333 | 0 |
| 0.8527777777777777 | 0 |
| 0.8534722222222223 | 0 |
| 0.8541666666666666 | 0 |
| 0.8548611111111111 | 0 |
| 0.8555555555555556 | 0 |
| 0.8562500000000001 | 0 |
| 0.8569444444444444 | 0 |
| 0.8576388888888888 | 0 |
| 0.8583333333333334 | 0 |
| 0.8590277777777778 | 0 |
| 0.8597222222222222 | 0 |
| 0.8604166666666666 | 0 |
| 0.8611111111111112 | 0 |
| 0.8618055555555556 | 0 |
| 0.8624999999999999 | 0 |
| 0.8631944444444444 | 0 |
| 0.8638888888888889 | 0 |
| 0.8645833333333334 | 0 |
| 0.8652777777777777 | 0 |
| 0.8659722222222223 | 0 |
| 0.8666666666666667 | 0 |
| 0.8673611111111111 | 0 |
| 0.8680555555555555 | 0 |
| 0.86875 | 0 |
| 0.8694444444444445 | 0 |
| 0.8701388888888889 | 0 |
| 0.8708333333333332 | 0 |
| 0.8715277777777778 | 0 |
| 0.8722222222222222 | 0 |
| 0.8729166666666667 | 0 |
| 0.873611111111111 | 0 |
| 0.8743055555555556 | 0 |
| 0.875 | 0 |
| 0.8756944444444444 | 0 |
| 0.876388888888889 | 0 |
| 0.8770833333333333 | 0 |
| 0.8777777777777778 | 0 |
| 0.8784722222222222 | 0 |
| 0.8791666666666668 | 0 |
| 0.8798611111111111 | 0 |
| 0.8805555555555555 | 0 |
| 0.88125 | 0 |
| 0.8819444444444445 | 0 |
| 0.8826388888888889 | 0 |
| 0.8833333333333333 | 0 |
| 0.8840277777777777 | 0 |
| 0.8847222222222223 | 0 |
| 0.8854166666666666 | 0 |
| 0.8861111111111111 | 0 |
| 0.8868055555555556 | 0 |
| 0.8875000000000001 | 0 |
| 0.8881944444444444 | 0 |
| 0.8888888888888888 | 0 |
| 0.8895833333333334 | 0 |
| 0.8902777777777778 | 0 |
| 0.8909722222222222 | 0 |
| 0.8916666666666666 | 0 |
| 0.8923611111111112 | 0 |
| 0.8930555555555556 | 0 |
| 0.8937499999999999 | 0 |
| 0.8944444444444444 | 0 |
| 0.8951388888888889 | 0 |
| 0.8958333333333334 | 0 |
| 0.8965277777777777 | 0 |
| 0.8972222222222223 | 0 |
| 0.8979166666666667 | 0 |
| 0.8986111111111111 | 0 |
| 0.8993055555555555 | 0 |
| 0.9 | 0 |
| 0.9006944444444445 | 0 |
| 0.9013888888888889 | 0 |
| 0.9020833333333332 | 0 |
| 0.9027777777777778 | 0 |
| 0.9034722222222222 | 0 |
| 0.9041666666666667 | 0 |
| 0.904861111111111 | 0 |
| 0.9055555555555556 | 0 |
| 0.90625 | 0 |
| 0.9069444444444444 | 0 |
| 0.907638888888889 | 0 |
| 0.9083333333333333 | 0 |
| 0.9090277777777778 | 0 |
| 0.9097222222222222 | 0 |
| 0.9104166666666668 | 0 |
| 0.9111111111111111 | 0 |
| 0.9118055555555555 | 0 |
| 0.9125 | 0 |
| 0.9131944444444445 | 0 |
| 0.9138888888888889 | 0 |
| 0.9145833333333333 | 0 |
| 0.9152777777777777 | 0 |
| 0.9159722222222223 | 0 |
| 0.9166666666666666 | 0 |
| 0.9173611111111111 | 0 |
| 0.9180555555555556 | 0 |
| 0.9187500000000001 | 0 |
| 0.9194444444444444 | 0 |
| 0.9201388888888888 | 0 |
| 0.9208333333333334 | 0 |
| 0.9215277777777778 | 0 |
| 0.9222222222222222 | 0 |
| 0.9229166666666666 | 0 |
| 0.9236111111111112 | 0 |
| 0.9243055555555556 | 0 |
| 0.9249999999999999 | 0 |
| 0.9256944444444444 | 0 |
| 0.9263888888888889 | 0 |
| 0.9270833333333334 | 0 |
| 0.9277777777777777 | 0 |
| 0.9284722222222223 | 0 |
| 0.9291666666666667 | 0 |
| 0.9298611111111111 | 0 |
| 0.9305555555555555 | 0 |
| 0.93125 | 0 |
| 0.9319444444444445 | 0 |
| 0.9326388888888889 | 0 |
| 0.9333333333333332 | 0 |
| 0.9340277777777778 | 0 |
| 0.9347222222222222 | 0 |
| 0.9354166666666667 | 0 |
| 0.936111111111111 | 0 |
| 0.9368055555555556 | 0 |
| 0.9375 | 0 |
| 0.9381944444444444 | 0 |
| 0.938888888888889 | 0 |
| 0.9395833333333333 | 0 |
| 0.9402777777777778 | 0 |
| 0.9409722222222222 | 0 |
| 0.9416666666666668 | 0 |
| 0.9423611111111111 | 0 |
| 0.9430555555555555 | 0 |
| 0.94375 | 0 |
| 0.9444444444444445 | 0 |
| 0.9451388888888889 | 0 |
| 0.9458333333333333 | 0 |
| 0.9465277777777777 | 0 |
| 0.9472222222222223 | 0 |
| 0.9479166666666666 | 0 |
| 0.9486111111111111 | 0 |
| 0.9493055555555556 | 0 |
| 0.9500000000000001 | 0 |
| 0.9506944444444444 | 0 |
| 0.9513888888888888 | 0 |
| 0.9520833333333334 | 0 |
| 0.9527777777777778 | 0 |
| 0.9534722222222222 | 0 |
| 0.9541666666666666 | 0 |
| 0.9548611111111112 | 0 |
| 0.9555555555555556 | 0 |
| 0.9562499999999999 | 0 |
| 0.9569444444444444 | 0 |
| 0.9576388888888889 | 0 |
| 0.9583333333333334 | 0 |
| 0.9590277777777777 | 0 |
| 0.9597222222222223 | 0 |
| 0.9604166666666667 | 0 |
| 0.9611111111111111 | 0 |
| 0.9618055555555555 | 0 |
| 0.9625 | 0 |
| 0.9631944444444445 | 0 |
| 0.9638888888888889 | 0 |
| 0.9645833333333332 | 0 |
| 0.9652777777777778 | 0 |
| 0.9659722222222222 | 0 |
| 0.9666666666666667 | 0 |
| 0.967361111111111 | 0 |
| 0.9680555555555556 | 0 |
| 0.96875 | 0 |
| 0.9694444444444444 | 0 |
| 0.970138888888889 | 0 |
| 0.9708333333333333 | 0 |
| 0.9715277777777778 | 0 |
| 0.9722222222222222 | 0 |
| 0.9729166666666668 | 0 |
| 0.9736111111111111 | 0 |
| 0.9743055555555555 | 0 |
| 0.975 | 0 |
| 0.9756944444444445 | 0 |
| 0.9763888888888889 | 0 |
| 0.9770833333333333 | 0 |
| 0.9777777777777777 | 0 |
| 0.9784722222222223 | 0 |
| 0.9791666666666666 | 0 |
| 0.9798611111111111 | 0 |
| 0.9805555555555556 | 0 |
| 0.9812500000000001 | 0 |
| 0.9819444444444444 | 0 |
| 0.9826388888888888 | 0 |
| 0.9833333333333334 | 0 |
| 0.9840277777777778 | 0 |
| 0.9847222222222222 | 0 |
| 0.9854166666666666 | 0 |
| 0.9861111111111112 | 0 |
| 0.9868055555555556 | 0 |
| 0.9874999999999999 | 0 |
| 0.9881944444444444 | 0 |
| 0.9888888888888889 | 0 |
| 0.9895833333333334 | 0 |
| 0.9902777777777777 | 0 |
| 0.9909722222222223 | 0 |
| 0.9916666666666667 | 0 |
| 0.9923611111111111 | 0 |
| 0.9930555555555555 | 0 |
| 0.99375 | 0 |
| 0.9944444444444445 | 0 |
| 0.9951388888888889 | 0 |
| 0.9958333333333332 | 0 |
| 0.9965277777777778 | 0 |
| 0.9972222222222222 | 0 |
| 0.9979166666666667 | 0 |
| 0.998611111111111 | 0 |
| 0.9993055555555556 | 0 |